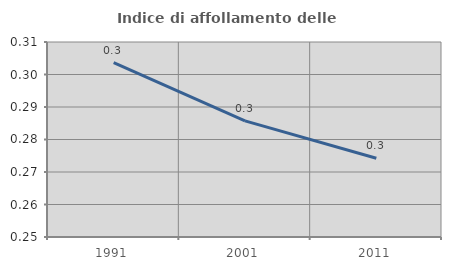
| Category | Indice di affollamento delle abitazioni  |
|---|---|
| 1991.0 | 0.304 |
| 2001.0 | 0.286 |
| 2011.0 | 0.274 |